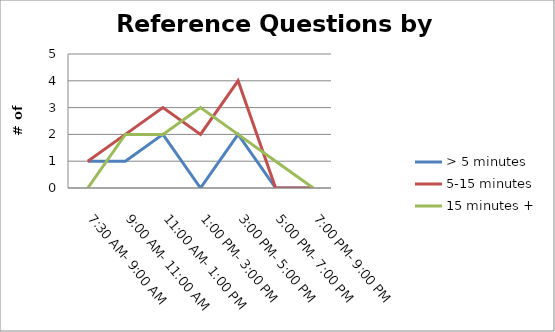
| Category | > 5 minutes | 5-15 minutes | 15 minutes + |
|---|---|---|---|
| 7:30 AM- 9:00 AM | 1 | 1 | 0 |
| 9:00 AM- 11:00 AM | 1 | 2 | 2 |
| 11:00 AM- 1:00 PM | 2 | 3 | 2 |
| 1:00 PM- 3:00 PM | 0 | 2 | 3 |
| 3:00 PM- 5:00 PM | 2 | 4 | 2 |
| 5:00 PM- 7:00 PM | 0 | 0 | 1 |
| 7:00 PM- 9:00 PM | 0 | 0 | 0 |